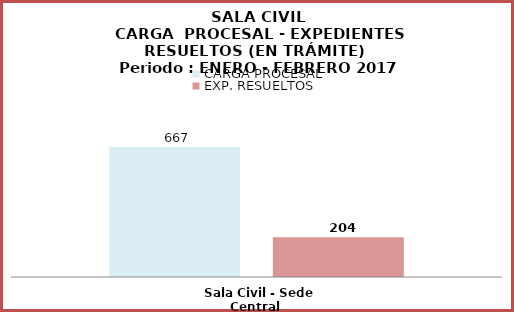
| Category | CARGA PROCESAL | EXP. RESUELTOS |
|---|---|---|
| Sala Civil - Sede Central | 667 | 204 |